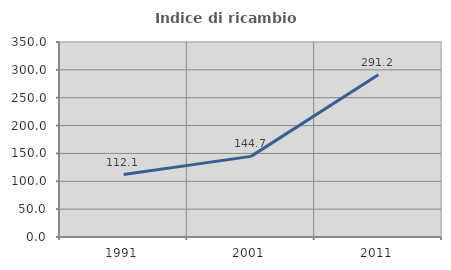
| Category | Indice di ricambio occupazionale  |
|---|---|
| 1991.0 | 112.136 |
| 2001.0 | 144.691 |
| 2011.0 | 291.154 |